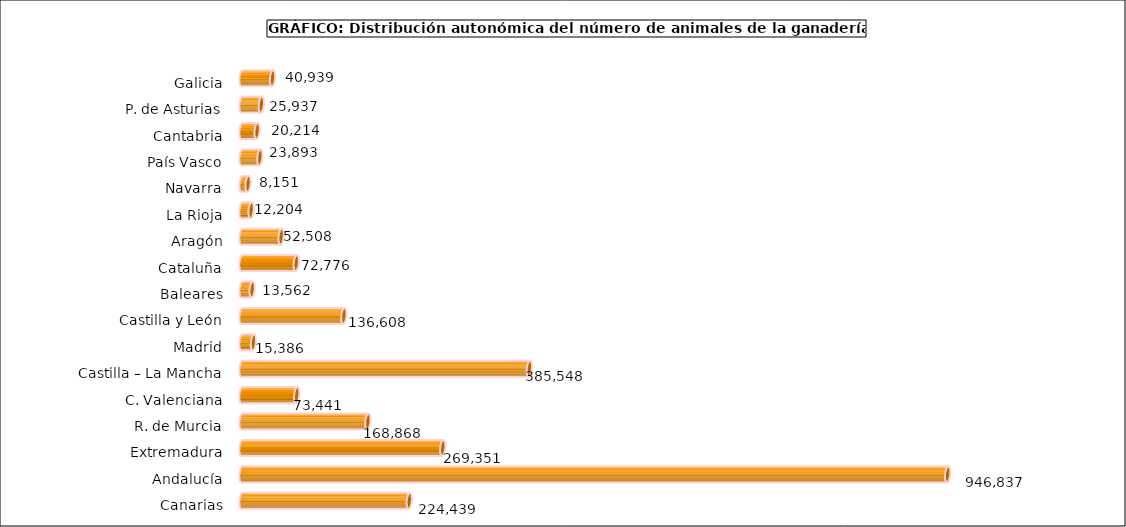
| Category | num. Animales |
|---|---|
| 0 | 40939 |
| 1 | 25937 |
| 2 | 20214 |
| 3 | 23893 |
| 4 | 8151 |
| 5 | 12204 |
| 6 | 52508 |
| 7 | 72776 |
| 8 | 13562 |
| 9 | 136608 |
| 10 | 15386 |
| 11 | 385548 |
| 12 | 73441 |
| 13 | 168868 |
| 14 | 269351 |
| 15 | 946837 |
| 16 | 224439 |